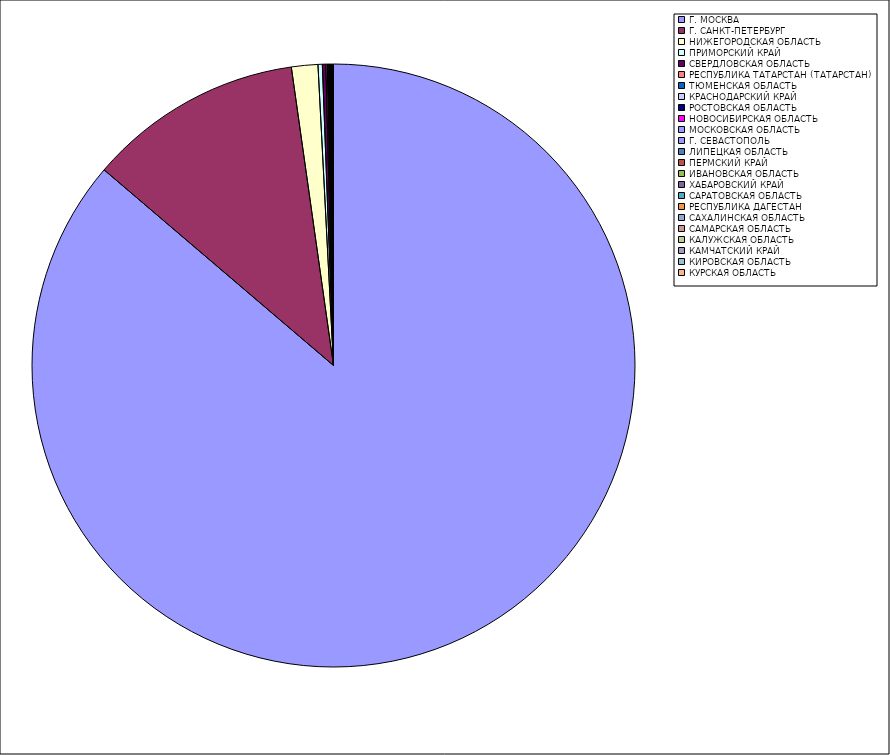
| Category | Оборот |
|---|---|
| Г. МОСКВА | 86.212 |
| Г. САНКТ-ПЕТЕРБУРГ | 11.523 |
| НИЖЕГОРОДСКАЯ ОБЛАСТЬ | 1.414 |
| ПРИМОРСКИЙ КРАЙ | 0.232 |
| СВЕРДЛОВСКАЯ ОБЛАСТЬ | 0.184 |
| РЕСПУБЛИКА ТАТАРСТАН (ТАТАРСТАН) | 0.074 |
| ТЮМЕНСКАЯ ОБЛАСТЬ | 0.048 |
| КРАСНОДАРСКИЙ КРАЙ | 0.043 |
| РОСТОВСКАЯ ОБЛАСТЬ | 0.032 |
| НОВОСИБИРСКАЯ ОБЛАСТЬ | 0.029 |
| МОСКОВСКАЯ ОБЛАСТЬ | 0.028 |
| Г. СЕВАСТОПОЛЬ | 0.023 |
| ЛИПЕЦКАЯ ОБЛАСТЬ | 0.021 |
| ПЕРМСКИЙ КРАЙ | 0.015 |
| ИВАНОВСКАЯ ОБЛАСТЬ | 0.015 |
| ХАБАРОВСКИЙ КРАЙ | 0.013 |
| САРАТОВСКАЯ ОБЛАСТЬ | 0.012 |
| РЕСПУБЛИКА ДАГЕСТАН | 0.011 |
| САХАЛИНСКАЯ ОБЛАСТЬ | 0.01 |
| САМАРСКАЯ ОБЛАСТЬ | 0.008 |
| КАЛУЖСКАЯ ОБЛАСТЬ | 0.007 |
| КАМЧАТСКИЙ КРАЙ | 0.006 |
| КИРОВСКАЯ ОБЛАСТЬ | 0.004 |
| КУРСКАЯ ОБЛАСТЬ | 0.004 |